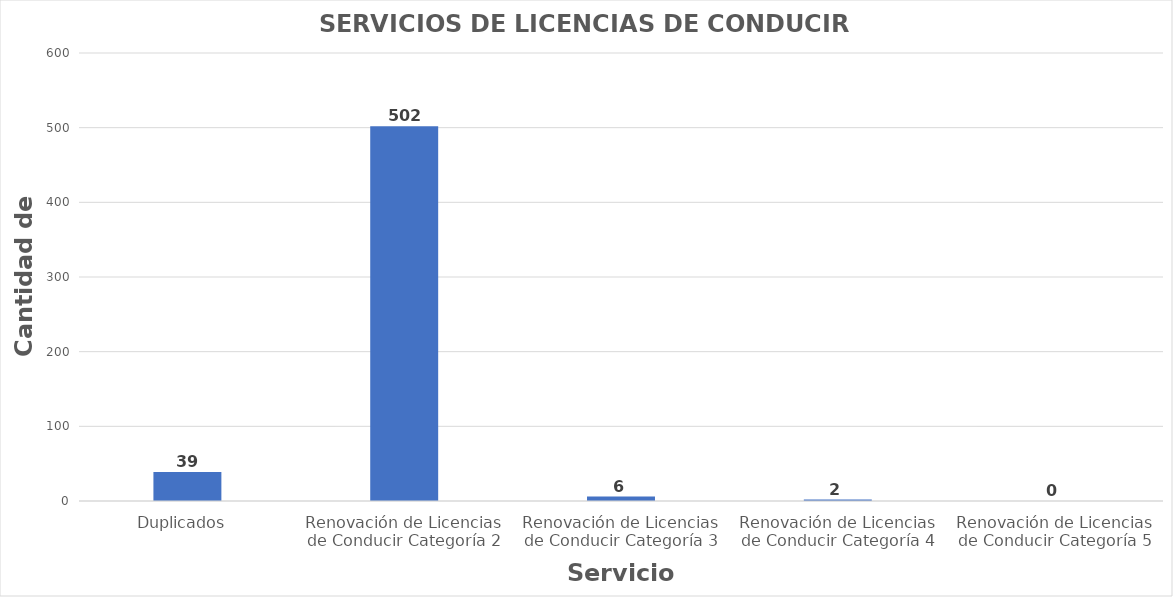
| Category | Series 0 |
|---|---|
| Duplicados  | 39 |
| Renovación de Licencias de Conducir Categoría 2 | 502 |
| Renovación de Licencias de Conducir Categoría 3 | 6 |
| Renovación de Licencias de Conducir Categoría 4 | 2 |
| Renovación de Licencias de Conducir Categoría 5 | 0 |